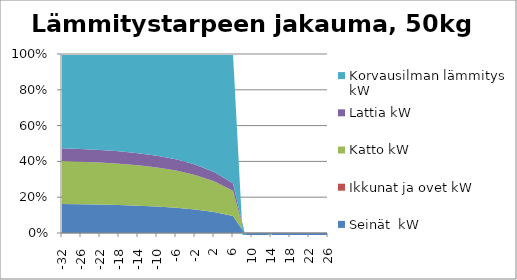
| Category | Seinät  kW | Ikkunat ja ovet kW | Katto kW | Lattia kW | Korvausilman lämmitys kW |
|---|---|---|---|---|---|
| -32.0 | 8.237 | 0 | 12.168 | 3.65 | 26.71 |
| -26.0 | 6.97 | 0 | 10.296 | 3.089 | 23.07 |
| -22.0 | 6.125 | 0 | 9.048 | 2.714 | 20.703 |
| -18.0 | 5.28 | 0 | 7.8 | 2.34 | 18.381 |
| -14.0 | 4.435 | 0 | 6.552 | 1.966 | 16.092 |
| -10.0 | 3.59 | 0 | 5.304 | 1.591 | 13.806 |
| -6.0 | 2.746 | 0 | 4.056 | 1.217 | 11.467 |
| -2.0 | 1.901 | 0 | 2.808 | 0.842 | 8.95 |
| 2.0 | 1.056 | 0 | 1.56 | 0.468 | 5.959 |
| 6.0 | 0.211 | 0 | 0.312 | 0.094 | 1.601 |
| 10.0 | -0.634 | 0 | -0.936 | -0.281 | -8.541 |
| 14.0 | -1.478 | 0 | -2.184 | -0.655 | -1427.22 |
| 18.0 | -2.323 | 0 | -3.432 | -1.03 | -6.416 |
| 22.0 | -3.168 | 0 | -4.68 | -1.404 | -8.748 |
| 26.0 | -4.013 | 0 | -5.928 | -1.778 | -11.081 |